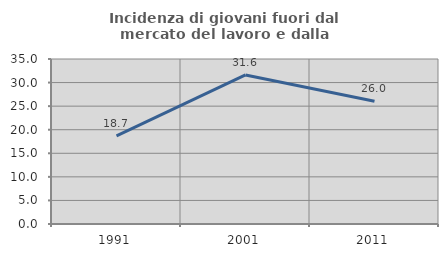
| Category | Incidenza di giovani fuori dal mercato del lavoro e dalla formazione  |
|---|---|
| 1991.0 | 18.672 |
| 2001.0 | 31.614 |
| 2011.0 | 26.047 |